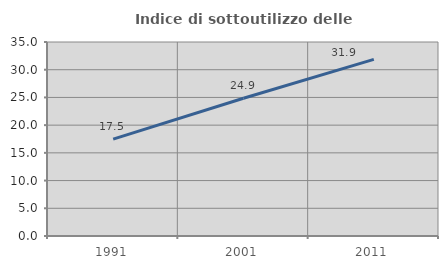
| Category | Indice di sottoutilizzo delle abitazioni  |
|---|---|
| 1991.0 | 17.484 |
| 2001.0 | 24.853 |
| 2011.0 | 31.87 |